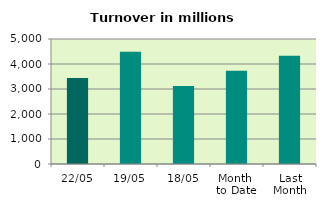
| Category | Series 0 |
|---|---|
| 22/05 | 3437.352 |
| 19/05 | 4490.586 |
| 18/05 | 3118.757 |
| Month 
to Date | 3727.947 |
| Last
Month | 4332.281 |